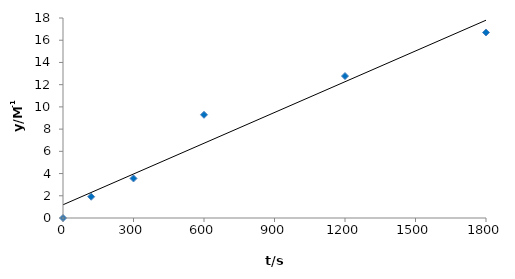
| Category | Series 0 |
|---|---|
| 0.0 | 0 |
| 120.0 | 1.914 |
| 300.0 | 3.557 |
| 600.0 | 9.292 |
| 1200.0 | 12.776 |
| 1800.0 | 16.696 |